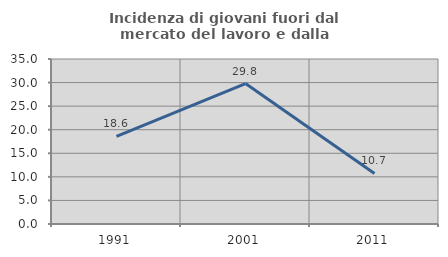
| Category | Incidenza di giovani fuori dal mercato del lavoro e dalla formazione  |
|---|---|
| 1991.0 | 18.605 |
| 2001.0 | 29.787 |
| 2011.0 | 10.714 |